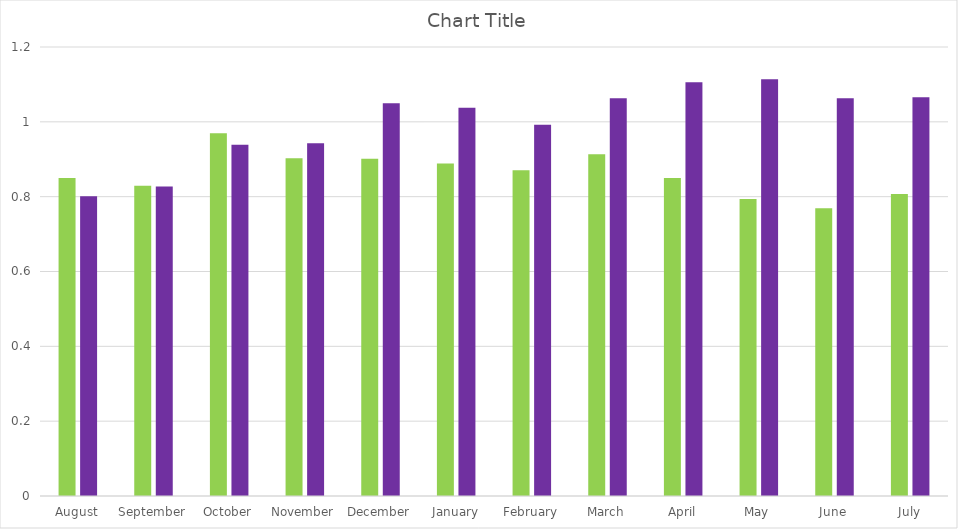
| Category | Series 0 | Series 1 |
|---|---|---|
| August | 0.85 | 0.801 |
| September | 0.829 | 0.827 |
| October | 0.969 | 0.939 |
| November | 0.903 | 0.943 |
| December | 0.901 | 1.049 |
| January | 0.888 | 1.038 |
| February | 0.871 | 0.992 |
| March | 0.913 | 1.063 |
| April | 0.85 | 1.106 |
| May | 0.794 | 1.114 |
| June | 0.769 | 1.063 |
| July | 0.807 | 1.066 |